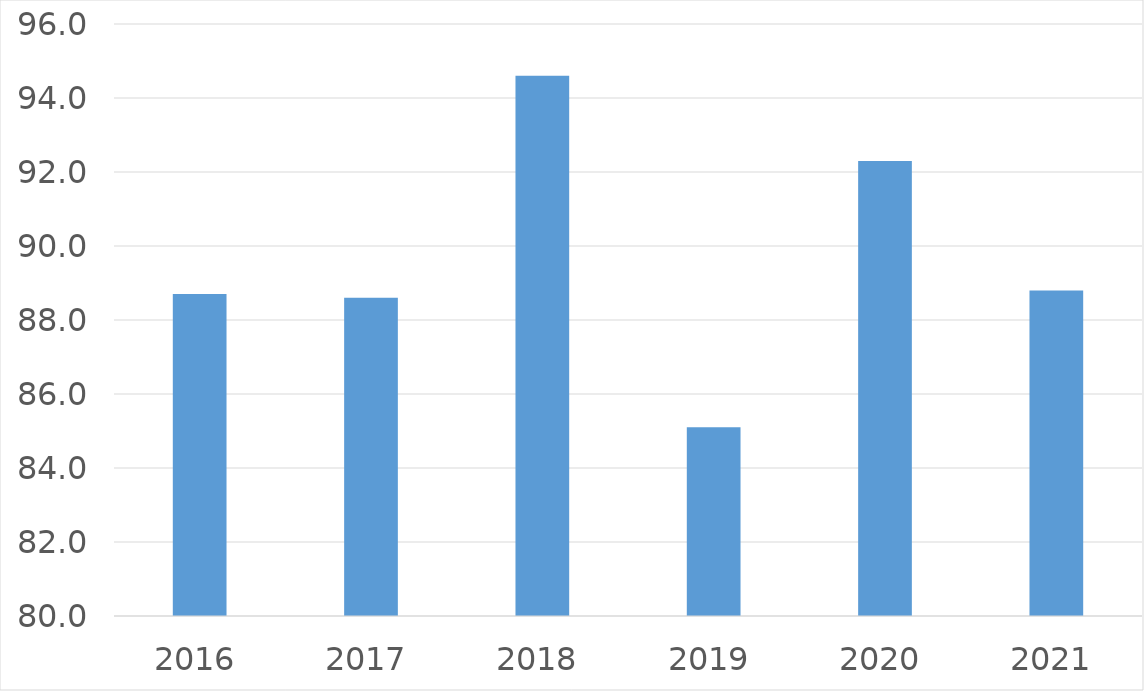
| Category | Series 0 |
|---|---|
| 2016 | 88.7 |
| 2017 | 88.6 |
| 2018 | 94.6 |
| 2019 | 85.1 |
| 2020 | 92.3 |
| 2021 | 88.8 |